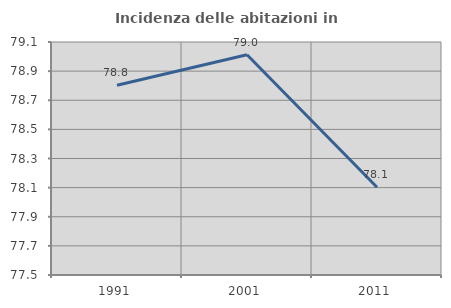
| Category | Incidenza delle abitazioni in proprietà  |
|---|---|
| 1991.0 | 78.803 |
| 2001.0 | 79.012 |
| 2011.0 | 78.102 |